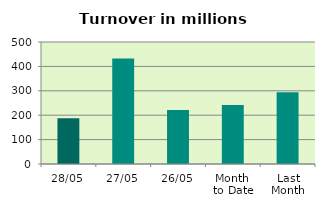
| Category | Series 0 |
|---|---|
| 28/05 | 187.775 |
| 27/05 | 432.121 |
| 26/05 | 220.946 |
| Month 
to Date | 242.229 |
| Last
Month | 294.539 |